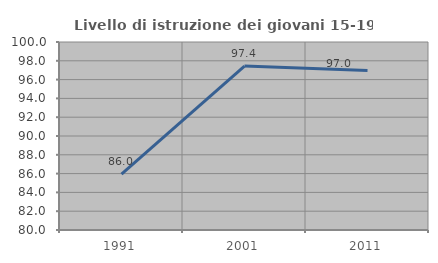
| Category | Livello di istruzione dei giovani 15-19 anni |
|---|---|
| 1991.0 | 85.95 |
| 2001.0 | 97.439 |
| 2011.0 | 96.963 |